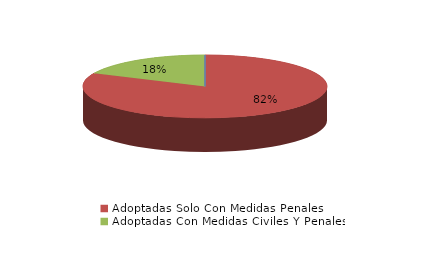
| Category | Series 0 |
|---|---|
| Denegadas | 0 |
| Adoptadas Solo Con Medidas Penales | 9 |
| Adoptadas Con Medidas Civiles Y Penales | 2 |
| Adoptadas Con Medidas Solo Civiles | 0 |